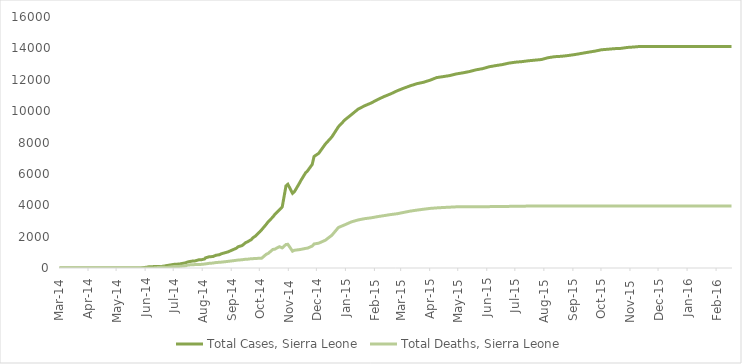
| Category | Total Cases, Sierra Leone | Total Deaths, Sierra Leone |
|---|---|---|
| 2014-03-01 | 0 | 0 |
| 2014-03-02 | 0 | 0 |
| 2014-03-03 | 0 | 0 |
| 2014-03-04 | 0 | 0 |
| 2014-03-05 | 0 | 0 |
| 2014-03-06 | 0 | 0 |
| 2014-03-07 | 0 | 0 |
| 2014-03-08 | 0 | 0 |
| 2014-03-09 | 0 | 0 |
| 2014-03-10 | 0 | 0 |
| 2014-03-11 | 0 | 0 |
| 2014-03-12 | 0 | 0 |
| 2014-03-13 | 0 | 0 |
| 2014-03-14 | 0 | 0 |
| 2014-03-15 | 0 | 0 |
| 2014-03-16 | 0 | 0 |
| 2014-03-17 | 0 | 0 |
| 2014-03-18 | 0 | 0 |
| 2014-03-19 | 0 | 0 |
| 2014-03-20 | 0 | 0 |
| 2014-03-21 | 0 | 0 |
| 2014-03-22 | 0 | 0 |
| 2014-03-23 | 0 | 0 |
| 2014-03-24 | 0 | 0 |
| 2014-03-25 | 0 | 0 |
| 2014-03-26 | 0 | 0 |
| 2014-03-27 | 6 | 5 |
| 2014-03-31 | 0 | 0 |
| 2014-04-01 | 0 | 0 |
| 2014-04-02 | 0 | 0 |
| 2014-04-07 | 0 | 0 |
| 2014-04-10 | 0 | 0 |
| 2014-04-17 | 0 | 0 |
| 2014-04-21 | 0 | 0 |
| 2014-04-23 | 0 | 0 |
| 2014-04-30 | 0 | 0 |
| 2014-05-05 | 0 | 0 |
| 2014-05-14 | 0 | 0 |
| 2014-05-23 | 0 | 0 |
| 2014-05-27 | 1 | 4 |
| 2014-05-28 | 16 | 5 |
| 2014-06-02 | 50 | 6 |
| 2014-06-05 | 81 | 7 |
| 2014-06-10 | 89 | 7 |
| 2014-06-11 | 117 | 19 |
| 2014-06-18 | 97 | 49 |
| 2014-06-24 | 158 | 34 |
| 2014-07-02 | 239 | 99 |
| 2014-07-07 | 252 | 101 |
| 2014-07-08 | 305 | 127 |
| 2014-07-14 | 337 | 142 |
| 2014-07-16 | 386 | 192 |
| 2014-07-21 | 442 | 206 |
| 2014-07-24 | 454 | 219 |
| 2014-07-28 | 525 | 224 |
| 2014-07-31 | 533 | 233 |
| 2014-08-03 | 574 | 252 |
| 2014-08-04 | 646 | 273 |
| 2014-08-08 | 717 | 298 |
| 2014-08-12 | 730 | 315 |
| 2014-08-13 | 783 | 334 |
| 2014-08-15 | 810 | 348 |
| 2014-08-19 | 848 | 365 |
| 2014-08-21 | 907 | 374 |
| 2014-08-22 | 910 | 392 |
| 2014-08-28 | 1026 | 422 |
| 2014-09-06 | 1261 | 491 |
| 2014-09-08 | 1361 | 509 |
| 2014-09-12 | 1424 | 524 |
| 2014-09-16 | 1620 | 562 |
| 2014-09-18 | 1673 | 562 |
| 2014-09-22 | 1813 | 593 |
| 2014-09-24 | 1940 | 597 |
| 2014-09-26 | 2021 | 605 |
| 2014-10-01 | 2304 | 622 |
| 2014-10-03 | 2437 | 623 |
| 2014-10-08 | 2789 | 879 |
| 2014-10-10 | 2950 | 930 |
| 2014-10-15 | 3252 | 1183 |
| 2014-10-17 | 3410 | 1200 |
| 2014-10-22 | 3706 | 1359 |
| 2014-10-25 | 3896 | 1281 |
| 2014-10-29 | 5235 | 1500 |
| 2014-10-31 | 5338 | 1510 |
| 2014-11-05 | 4759 | 1070 |
| 2014-11-07 | 4862 | 1130 |
| 2014-11-12 | 5368 | 1169 |
| 2014-11-14 | 5586 | 1187 |
| 2014-11-19 | 6073 | 1250 |
| 2014-11-21 | 6190 | 1267 |
| 2014-11-26 | 6599 | 1398 |
| 2014-11-28 | 7109 | 1530 |
| 2014-12-03 | 7312 | 1583 |
| 2014-12-10 | 7897 | 1768 |
| 2014-12-17 | 8356 | 2085 |
| 2014-12-24 | 9004 | 2582 |
| 2014-12-31 | 9446 | 2758 |
| 2015-01-07 | 9780 | 2943 |
| 2015-01-14 | 10124 | 3062 |
| 2015-01-21 | 10340 | 3145 |
| 2015-01-28 | 10518 | 3199 |
| 2015-02-04 | 10740 | 3276 |
| 2015-02-11 | 10934 | 3341 |
| 2015-02-18 | 11103 | 3408 |
| 2015-02-25 | 11301 | 3461 |
| 2015-03-04 | 11466 | 3546 |
| 2015-03-11 | 11619 | 3629 |
| 2015-03-18 | 11751 | 3691 |
| 2015-03-25 | 11841 | 3747 |
| 2015-04-01 | 11974 | 3799 |
| 2015-04-08 | 12138 | 3831 |
| 2015-04-15 | 12201 | 3857 |
| 2015-04-22 | 12267 | 3877 |
| 2015-04-29 | 12371 | 3899 |
| 2015-05-06 | 12440 | 3903 |
| 2015-05-13 | 12523 | 3904 |
| 2015-05-20 | 12632 | 3907 |
| 2015-05-27 | 12706 | 3908 |
| 2015-06-03 | 12827 | 3912 |
| 2015-06-10 | 12901 | 3915 |
| 2015-06-17 | 12965 | 3919 |
| 2015-06-24 | 13059 | 3928 |
| 2015-07-01 | 13119 | 3932 |
| 2015-07-08 | 13155 | 3940 |
| 2015-07-15 | 13209 | 3947 |
| 2015-07-22 | 13250 | 3949 |
| 2015-07-29 | 13290 | 3951 |
| 2015-08-05 | 13406 | 3951 |
| 2015-08-12 | 13470 | 3951 |
| 2015-08-19 | 13494 | 3952 |
| 2015-08-26 | 13541 | 3952 |
| 2015-09-03 | 13609 | 3953 |
| 2015-09-10 | 13683 | 3953 |
| 2015-09-17 | 13756 | 3953 |
| 2015-09-24 | 13823 | 3955 |
| 2015-10-01 | 13911 | 3955 |
| 2015-10-08 | 13945 | 3955 |
| 2015-10-15 | 13982 | 3955 |
| 2015-10-22 | 14001 | 3955 |
| 2015-10-29 | 14061 | 3955 |
| 2015-11-05 | 14089 | 3955 |
| 2015-11-11 | 14122 | 3955 |
| 2015-11-18 | 14122 | 3955 |
| 2015-11-25 | 14122 | 3955 |
| 2015-12-02 | 14122 | 3955 |
| 2015-12-09 | 14122 | 3955 |
| 2015-12-16 | 14122 | 3955 |
| 2015-12-23 | 14122 | 3955 |
| 2015-12-30 | 14122 | 3955 |
| 2016-01-06 | 14122 | 3955 |
| 2016-01-13 | 14122 | 3955 |
| 2016-01-20 | 14123 | 3956 |
| 2016-01-27 | 14124 | 3956 |
| 2016-02-03 | 14124 | 3956 |
| 2016-02-10 | 14124 | 3956 |
| 2016-02-17 | 14124 | 3956 |